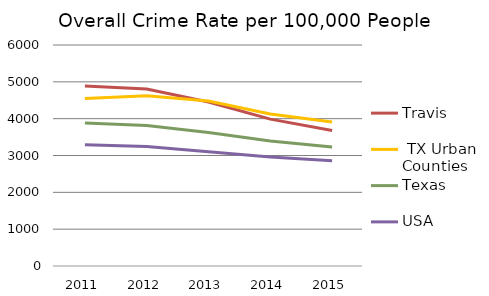
| Category | Travis  | Series 1 | Texas | USA |
|---|---|---|---|---|
| 2011.0 | 4885.399 | 4546.259 | 3884.7 | 3294.93 |
| 2012.0 | 4806 | 4625.318 | 3811.8 | 3246.08 |
| 2013.0 | 4453 | 4477.857 | 3625.6 | 3098.628 |
| 2014.0 | 3988 | 4127.394 | 3392.2 | 2961.582 |
| 2015.0 | 3676.616 | 3909.823 | 3233.3 | 2859.613 |